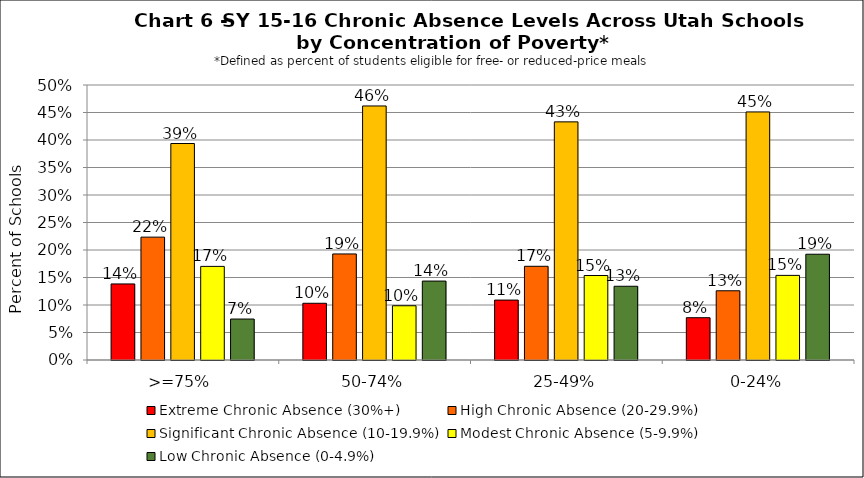
| Category | Extreme Chronic Absence (30%+) | High Chronic Absence (20-29.9%) | Significant Chronic Absence (10-19.9%) | Modest Chronic Absence (5-9.9%) | Low Chronic Absence (0-4.9%) |
|---|---|---|---|---|---|
| 0 | 0.138 | 0.223 | 0.394 | 0.17 | 0.074 |
| 1 | 0.103 | 0.193 | 0.462 | 0.099 | 0.143 |
| 2 | 0.109 | 0.17 | 0.433 | 0.154 | 0.134 |
| 3 | 0.077 | 0.126 | 0.451 | 0.154 | 0.192 |